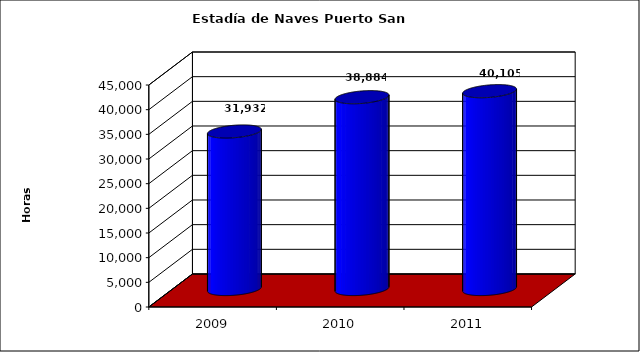
| Category | Series 0 |
|---|---|
| 2009.0 | 31932 |
| 2010.0 | 38884 |
| 2011.0 | 40105 |